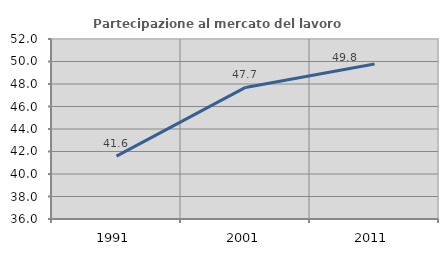
| Category | Partecipazione al mercato del lavoro  femminile |
|---|---|
| 1991.0 | 41.584 |
| 2001.0 | 47.696 |
| 2011.0 | 49.777 |